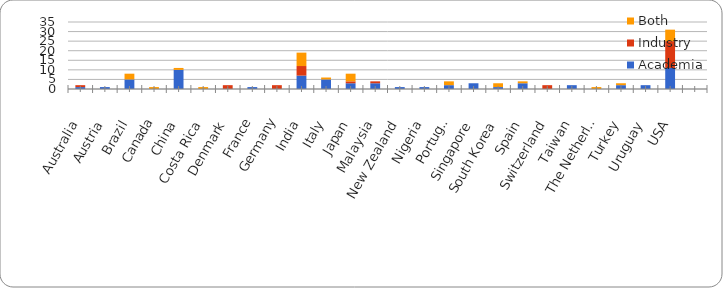
| Category | Academia | Industry | Both |
|---|---|---|---|
| Australia | 1 | 1 | 0 |
| Austria | 1 | 0 | 0 |
| Brazil | 5 | 0 | 3 |
| Canada | 0 | 0 | 1 |
| China | 10 | 0 | 1 |
| Costa Rica | 0 | 0 | 1 |
| Denmark | 0 | 2 | 0 |
| France | 1 | 0 | 0 |
| Germany | 0 | 2 | 0 |
| India | 7 | 5 | 7 |
| Italy | 5 | 0 | 1 |
| Japan | 3 | 1 | 4 |
| Malaysia | 3 | 1 | 0 |
| New Zealand | 1 | 0 | 0 |
| Nigeria | 1 | 0 | 0 |
| Portugal | 2 | 0 | 2 |
| Singapore | 3 | 0 | 0 |
| South Korea | 1 | 0 | 2 |
| Spain | 3 | 0 | 1 |
| Switzerland | 0 | 2 | 0 |
| Taiwan | 2 | 0 | 0 |
| The Netherlands | 0 | 0 | 1 |
| Turkey | 2 | 0 | 1 |
| Uruguay | 2 | 0 | 0 |
| USA | 11 | 14 | 6 |